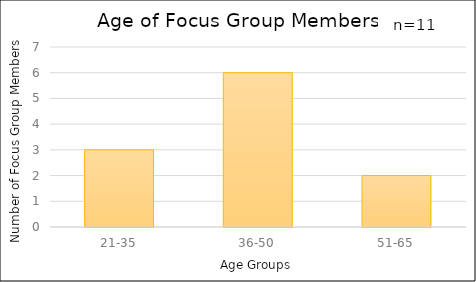
| Category | Series 0 |
|---|---|
| 21-35 | 3 |
| 36-50 | 6 |
| 51-65 | 2 |